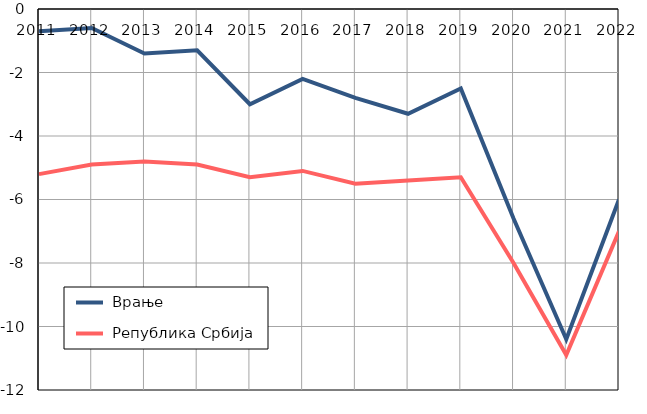
| Category |  Врање |  Република Србија |
|---|---|---|
| 2011.0 | -0.7 | -5.2 |
| 2012.0 | -0.6 | -4.9 |
| 2013.0 | -1.4 | -4.8 |
| 2014.0 | -1.3 | -4.9 |
| 2015.0 | -3 | -5.3 |
| 2016.0 | -2.2 | -5.1 |
| 2017.0 | -2.8 | -5.5 |
| 2018.0 | -3.3 | -5.4 |
| 2019.0 | -2.5 | -5.3 |
| 2020.0 | -6.6 | -8 |
| 2021.0 | -10.4 | -10.9 |
| 2022.0 | -6 | -7 |